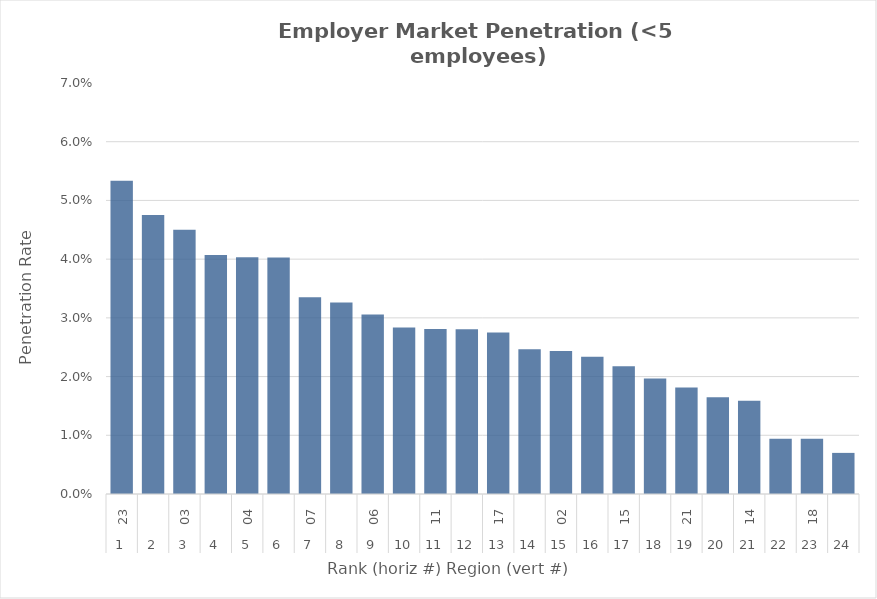
| Category | Rate |
|---|---|
| 0 | 0.053 |
| 1 | 0.048 |
| 2 | 0.045 |
| 3 | 0.041 |
| 4 | 0.04 |
| 5 | 0.04 |
| 6 | 0.034 |
| 7 | 0.033 |
| 8 | 0.031 |
| 9 | 0.028 |
| 10 | 0.028 |
| 11 | 0.028 |
| 12 | 0.027 |
| 13 | 0.025 |
| 14 | 0.024 |
| 15 | 0.023 |
| 16 | 0.022 |
| 17 | 0.02 |
| 18 | 0.018 |
| 19 | 0.016 |
| 20 | 0.016 |
| 21 | 0.009 |
| 22 | 0.009 |
| 23 | 0.007 |